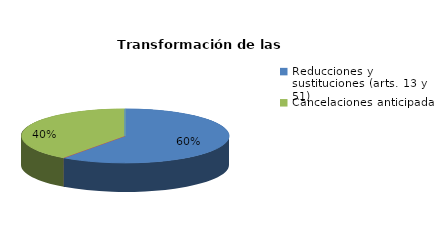
| Category | Series 0 |
|---|---|
| Reducciones y sustituciones (arts. 13 y 51) | 3 |
| Por quebrantamiento (art. 50.2) | 0 |
| Cancelaciones anticipadas | 2 |
| Traslado a Centros Penitenciarios | 0 |
| Conversión internamientos en cerrados (art. 51.2) | 0 |